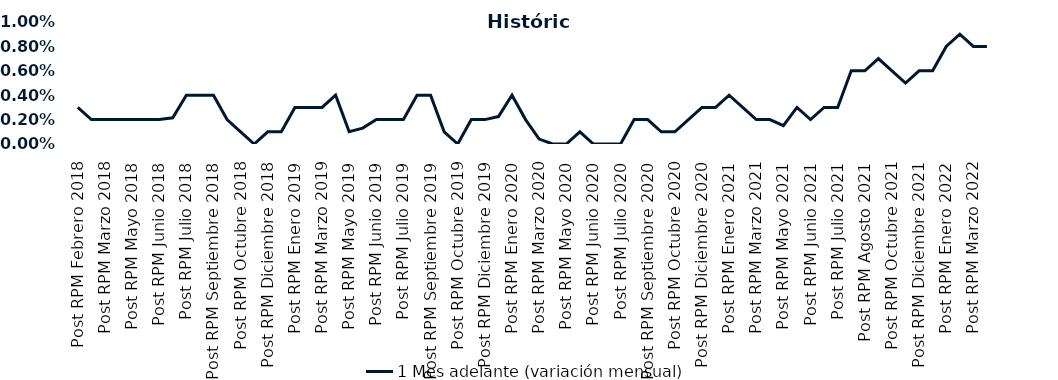
| Category | 1 Mes adelante (variación mensual) |
|---|---|
| Post RPM Febrero 2018 | 0.003 |
| Pre RPM Marzo 2018 | 0.002 |
| Post RPM Marzo 2018 | 0.002 |
| Pre RPM Mayo 2018 | 0.002 |
| Post RPM Mayo 2018 | 0.002 |
| Pre RPM Junio 2018 | 0.002 |
| Post RPM Junio 2018 | 0.002 |
| Pre RPM Julio 2018 | 0.002 |
| Post RPM Julio 2018 | 0.004 |
| Pre RPM Septiembre 2018 | 0.004 |
| Post RPM Septiembre 2018 | 0.004 |
| Pre RPM Octubre 2018 | 0.002 |
| Post RPM Octubre 2018 | 0.001 |
| Pre RPM Diciembre 2018 | 0 |
| Post RPM Diciembre 2018 | 0.001 |
| Pre RPM Enero 2019 | 0.001 |
| Post RPM Enero 2019 | 0.003 |
| Pre RPM Marzo 2019 | 0.003 |
| Post RPM Marzo 2019 | 0.003 |
| Pre RPM Mayo 2019 | 0.004 |
| Post RPM Mayo 2019 | 0.001 |
| Pre RPM Junio 2019 | 0.001 |
| Post RPM Junio 2019 | 0.002 |
| Pre RPM Julio 2019 | 0.002 |
| Post RPM Julio 2019 | 0.002 |
| Pre RPM Septiembre 2019 | 0.004 |
| Post RPM Septiembre 2019 | 0.004 |
| Pre RPM Octubre 2019 | 0.001 |
| Post RPM Octubre 2019 | 0 |
| Pre RPM Diciembre 2019 | 0.002 |
| Post RPM Diciembre 2019 | 0.002 |
| Pre RPM Enero 2020 | 0.002 |
| Post RPM Enero 2020 | 0.004 |
| Pre RPM Marzo 2020 | 0.002 |
| Post RPM Marzo 2020 | 0 |
| Pre RPM Mayo 2020 | 0 |
| Post RPM Mayo 2020 | 0 |
| Pre RPM Junio 2020 | 0.001 |
| Post RPM Junio 2020 | 0 |
| Pre RPM Julio 2020 | 0 |
| Post RPM Julio 2020 | 0 |
| Pre RPM Septiembre 2020 | 0.002 |
| Post RPM Septiembre 2020 | 0.002 |
| Pre RPM Octubre 2020 | 0.001 |
| Post RPM Octubre 2020 | 0.001 |
| Pre RPM Diciembre 2020 | 0.002 |
| Post RPM Diciembre 2020 | 0.003 |
| Pre RPM Enero 2021 | 0.003 |
| Post RPM Enero 2021 | 0.004 |
| Pre RPM Marzo 2021 | 0.003 |
| Post RPM Marzo 2021 | 0.002 |
| Pre RPM Mayo 2021 | 0.002 |
| Post RPM Mayo 2021 | 0.002 |
| Pre RPM Junio 2021 | 0.003 |
| Post RPM Junio 2021 | 0.002 |
| Pre RPM Julio 2021 | 0.003 |
| Post RPM Julio 2021 | 0.003 |
| Pre RPM Agosto 2021 | 0.006 |
| Post RPM Agosto 2021 | 0.006 |
| Pre RPM Octubre 2021 | 0.007 |
| Post RPM Octubre 2021 | 0.006 |
| Pre RPM Diciembre 2021 | 0.005 |
| Post RPM Diciembre 2021 | 0.006 |
| Pre RPM Enero 2022 | 0.006 |
| Post RPM Enero 2022 | 0.008 |
| Pre RPM Marzo 2022 | 0.009 |
| Post RPM Marzo 2022 | 0.008 |
| Pre RPM Mayo 2022 | 0.008 |